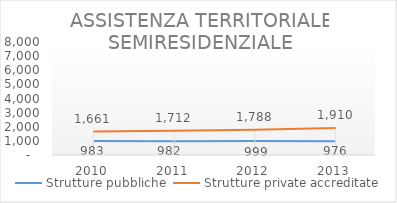
| Category | Strutture pubbliche | Strutture private accreditate |
|---|---|---|
| 2010.0 | 983 | 1661 |
| 2011.0 | 982 | 1712 |
| 2012.0 | 999 | 1788 |
| 2013.0 | 976 | 1910 |